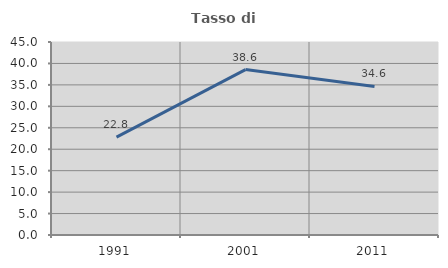
| Category | Tasso di occupazione   |
|---|---|
| 1991.0 | 22.831 |
| 2001.0 | 38.571 |
| 2011.0 | 34.634 |